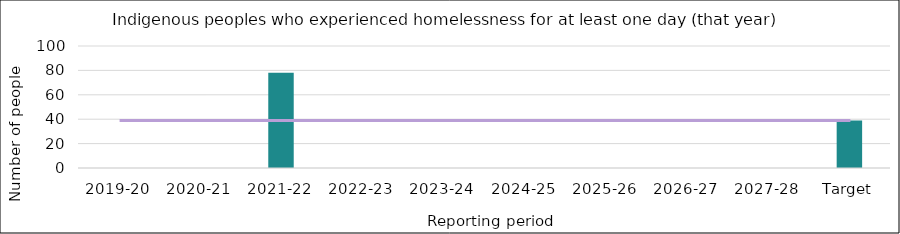
| Category | Series 0 |
|---|---|
| 2019-20 | 0 |
| 2020-21 | 0 |
| 2021-22 | 78 |
| 2022-23 | 0 |
| 2023-24 | 0 |
| 2024-25 | 0 |
| 2025-26 | 0 |
| 2026-27 | 0 |
| 2027-28 | 0 |
| Target | 39 |